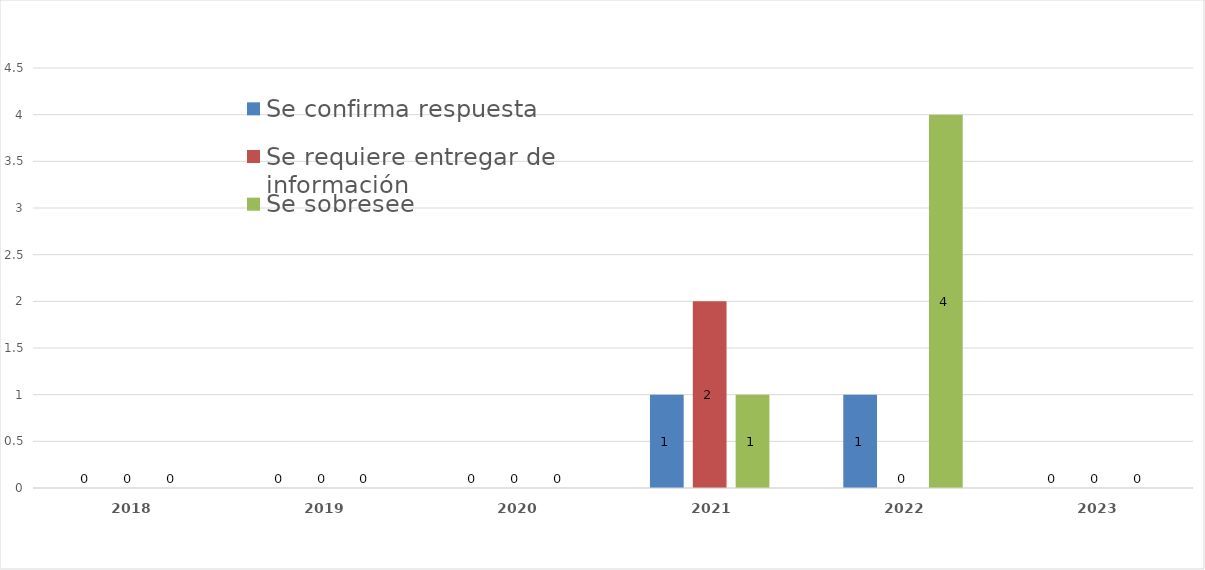
| Category | Se confirma respuesta | Se requiere entregar de información  | Se sobresee  |
|---|---|---|---|
| 2018.0 | 0 | 0 | 0 |
| 2019.0 | 0 | 0 | 0 |
| 2020.0 | 0 | 0 | 0 |
| 2021.0 | 1 | 2 | 1 |
| 2022.0 | 1 | 0 | 4 |
| 2023.0 | 0 | 0 | 0 |